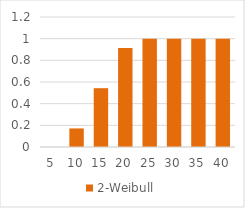
| Category | 2-Weibull |
|---|---|
| 5.0 | 0 |
| 10.0 | 0.171 |
| 15.0 | 0.543 |
| 20.0 | 0.914 |
| 25.0 | 1 |
| 30.0 | 1 |
| 35.0 | 1 |
| 40.0 | 1 |